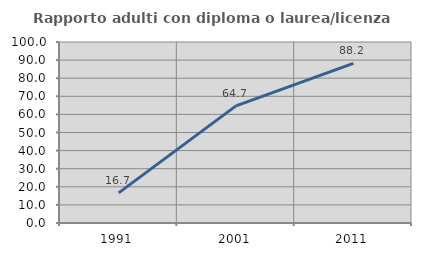
| Category | Rapporto adulti con diploma o laurea/licenza media  |
|---|---|
| 1991.0 | 16.667 |
| 2001.0 | 64.706 |
| 2011.0 | 88.235 |